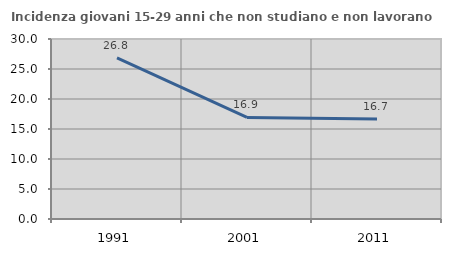
| Category | Incidenza giovani 15-29 anni che non studiano e non lavorano  |
|---|---|
| 1991.0 | 26.844 |
| 2001.0 | 16.923 |
| 2011.0 | 16.667 |